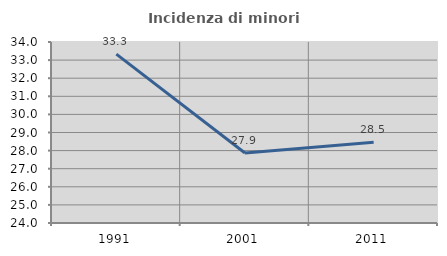
| Category | Incidenza di minori stranieri |
|---|---|
| 1991.0 | 33.333 |
| 2001.0 | 27.869 |
| 2011.0 | 28.455 |